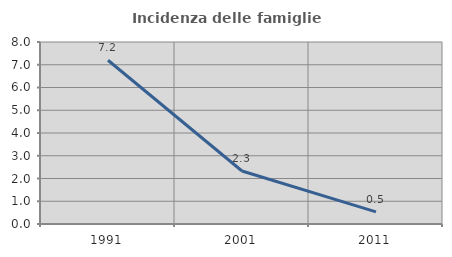
| Category | Incidenza delle famiglie numerose |
|---|---|
| 1991.0 | 7.199 |
| 2001.0 | 2.329 |
| 2011.0 | 0.533 |